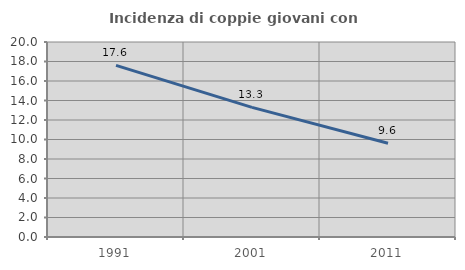
| Category | Incidenza di coppie giovani con figli |
|---|---|
| 1991.0 | 17.605 |
| 2001.0 | 13.297 |
| 2011.0 | 9.62 |